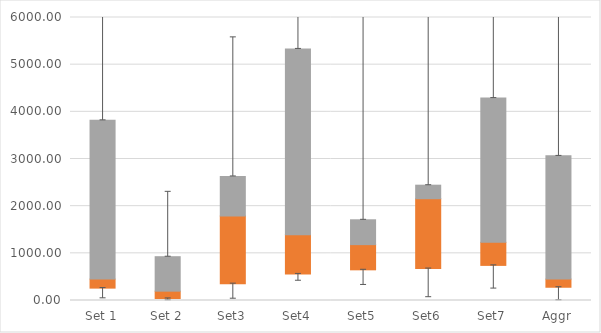
| Category | Q1 | Median-Q1 | Q3-Median |
|---|---|---|---|
| Set 1 | 262.42 | 191.104 | 3366.661 |
| Set 2 | 42.812 | 155.188 | 730.897 |
| Set3 | 356.171 | 1433.594 | 841.4 |
| Set4 | 562.294 | 833.717 | 3938.749 |
| Set5 | 650.241 | 534.246 | 526.921 |
| Set6 | 676.328 | 1481.804 | 286.826 |
| Set7 | 744.235 | 488.163 | 3060.204 |
| Aggr | 280.866 | 172.657 | 2613.06 |